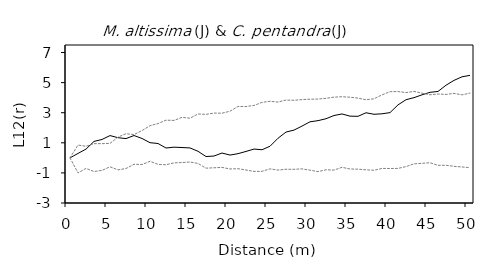
| Category | L12(r) | E12- | E12+ |
|---|---|---|---|
| 0.0 | 0 | 0 | 0 |
| 1.0 | 0.294 | -1 | 0.85 |
| 2.0 | 0.582 | -0.702 | 0.771 |
| 3.0 | 1.093 | -0.907 | 0.943 |
| 4.0 | 1.223 | -0.833 | 0.944 |
| 5.0 | 1.48 | -0.594 | 0.962 |
| 6.0 | 1.34 | -0.799 | 1.377 |
| 7.0 | 1.281 | -0.709 | 1.606 |
| 8.0 | 1.484 | -0.425 | 1.545 |
| 9.0 | 1.289 | -0.443 | 1.813 |
| 10.0 | 1.008 | -0.231 | 2.136 |
| 11.0 | 0.955 | -0.432 | 2.277 |
| 12.0 | 0.655 | -0.459 | 2.505 |
| 13.0 | 0.709 | -0.335 | 2.487 |
| 14.0 | 0.687 | -0.309 | 2.693 |
| 15.0 | 0.66 | -0.278 | 2.634 |
| 16.0 | 0.437 | -0.369 | 2.917 |
| 17.0 | 0.088 | -0.685 | 2.889 |
| 18.0 | 0.122 | -0.66 | 2.975 |
| 19.0 | 0.32 | -0.632 | 2.968 |
| 20.0 | 0.185 | -0.74 | 3.099 |
| 21.0 | 0.279 | -0.72 | 3.413 |
| 22.0 | 0.426 | -0.807 | 3.41 |
| 23.0 | 0.585 | -0.9 | 3.483 |
| 24.0 | 0.538 | -0.896 | 3.686 |
| 25.0 | 0.772 | -0.73 | 3.759 |
| 26.0 | 1.304 | -0.814 | 3.707 |
| 27.0 | 1.714 | -0.757 | 3.84 |
| 28.0 | 1.845 | -0.761 | 3.827 |
| 29.0 | 2.111 | -0.731 | 3.872 |
| 30.0 | 2.396 | -0.816 | 3.899 |
| 31.0 | 2.472 | -0.917 | 3.906 |
| 32.0 | 2.6 | -0.791 | 3.954 |
| 33.0 | 2.814 | -0.814 | 4.036 |
| 34.0 | 2.918 | -0.629 | 4.062 |
| 35.0 | 2.772 | -0.74 | 4.03 |
| 36.0 | 2.761 | -0.752 | 3.971 |
| 37.0 | 2.998 | -0.795 | 3.862 |
| 38.0 | 2.896 | -0.825 | 3.924 |
| 39.0 | 2.928 | -0.702 | 4.185 |
| 40.0 | 3.006 | -0.707 | 4.398 |
| 41.0 | 3.52 | -0.702 | 4.406 |
| 42.0 | 3.864 | -0.582 | 4.339 |
| 43.0 | 4 | -0.398 | 4.415 |
| 44.0 | 4.19 | -0.362 | 4.301 |
| 45.0 | 4.355 | -0.325 | 4.192 |
| 46.0 | 4.412 | -0.496 | 4.244 |
| 47.0 | 4.826 | -0.493 | 4.214 |
| 48.0 | 5.149 | -0.563 | 4.285 |
| 49.0 | 5.386 | -0.605 | 4.186 |
| 50.0 | 5.482 | -0.649 | 4.303 |